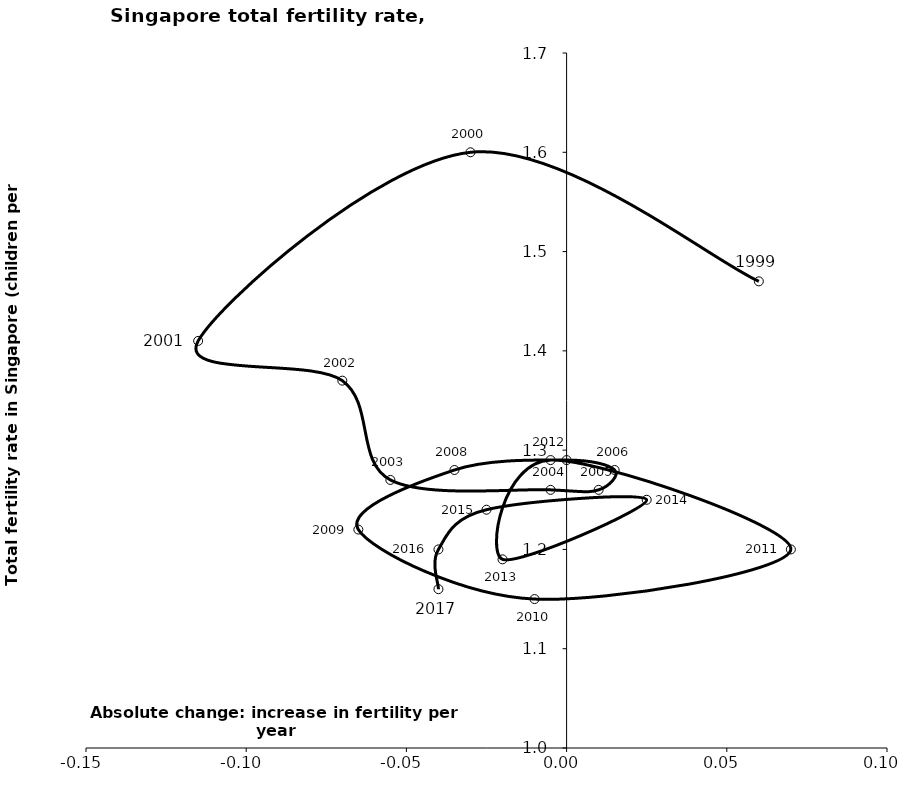
| Category | Series 0 |
|---|---|
| 0.06000000000000005 | 1.47 |
| -0.030000000000000027 | 1.6 |
| -0.11499999999999999 | 1.41 |
| -0.06999999999999995 | 1.37 |
| -0.05500000000000005 | 1.27 |
| -0.0050000000000000044 | 1.26 |
| 0.010000000000000009 | 1.26 |
| 0.015000000000000013 | 1.28 |
| 0.0 | 1.29 |
| -0.03500000000000003 | 1.28 |
| -0.06500000000000006 | 1.22 |
| -0.010000000000000009 | 1.15 |
| 0.07000000000000006 | 1.2 |
| -0.0050000000000000044 | 1.29 |
| -0.020000000000000018 | 1.19 |
| 0.025000000000000022 | 1.25 |
| -0.025000000000000022 | 1.24 |
| -0.040000000000000036 | 1.2 |
| -0.040000000000000036 | 1.16 |